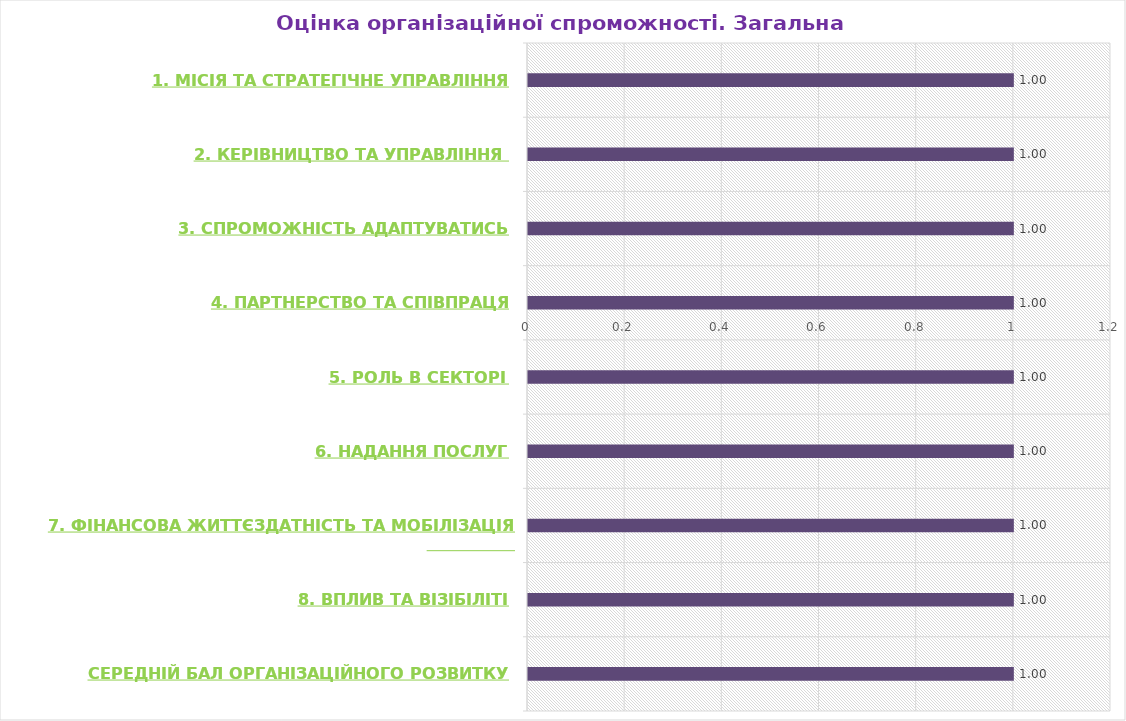
| Category | Series 0 | Series 10 | Series 11 |
|---|---|---|---|
| 1. Місія та стратегічне управління |  | 1 |  |
| 2. Керівництво та управління  |  | 1 |  |
| 3. Спроможність адаптуватись |  | 1 |  |
| 4. Партнерство та співпраця |  | 1 |  |
| 5. Роль в секторі  |  | 1 |  |
| 6. Надання послуг |  | 1 |  |
| 7. Фінансова життєздатність та мобілізація ресурсів |  | 1 |  |
| 8. Вплив та візібіліті |  | 1 |  |
| Середній бал організаційного розвитку |  | 1 |  |